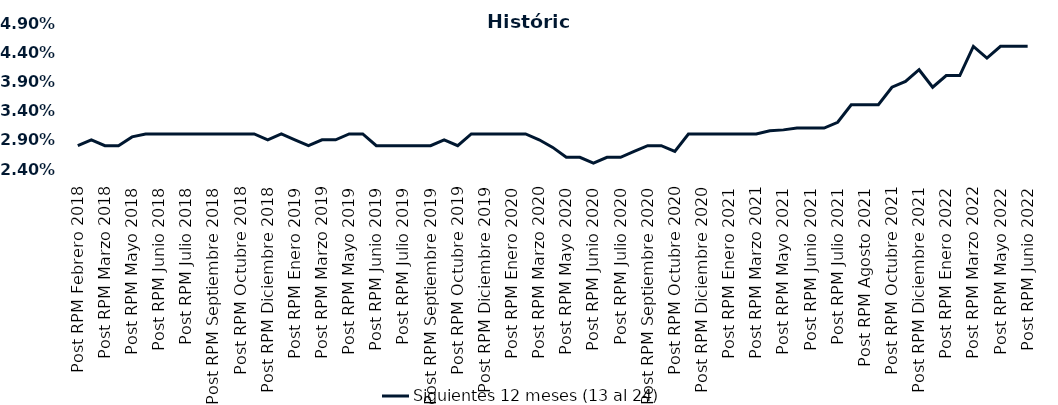
| Category | Siguientes 12 meses (13 al 24)  |
|---|---|
| Post RPM Febrero 2018 | 0.028 |
| Pre RPM Marzo 2018 | 0.029 |
| Post RPM Marzo 2018 | 0.028 |
| Pre RPM Mayo 2018 | 0.028 |
| Post RPM Mayo 2018 | 0.03 |
| Pre RPM Junio 2018 | 0.03 |
| Post RPM Junio 2018 | 0.03 |
| Pre RPM Julio 2018 | 0.03 |
| Post RPM Julio 2018 | 0.03 |
| Pre RPM Septiembre 2018 | 0.03 |
| Post RPM Septiembre 2018 | 0.03 |
| Pre RPM Octubre 2018 | 0.03 |
| Post RPM Octubre 2018 | 0.03 |
| Pre RPM Diciembre 2018 | 0.03 |
| Post RPM Diciembre 2018 | 0.029 |
| Pre RPM Enero 2019 | 0.03 |
| Post RPM Enero 2019 | 0.029 |
| Pre RPM Marzo 2019 | 0.028 |
| Post RPM Marzo 2019 | 0.029 |
| Pre RPM Mayo 2019 | 0.029 |
| Post RPM Mayo 2019 | 0.03 |
| Pre RPM Junio 2019 | 0.03 |
| Post RPM Junio 2019 | 0.028 |
| Pre RPM Julio 2019 | 0.028 |
| Post RPM Julio 2019 | 0.028 |
| Pre RPM Septiembre 2019 | 0.028 |
| Post RPM Septiembre 2019 | 0.028 |
| Pre RPM Octubre 2019 | 0.029 |
| Post RPM Octubre 2019 | 0.028 |
| Pre RPM Diciembre 2019 | 0.03 |
| Post RPM Diciembre 2019 | 0.03 |
| Pre RPM Enero 2020 | 0.03 |
| Post RPM Enero 2020 | 0.03 |
| Pre RPM Marzo 2020 | 0.03 |
| Post RPM Marzo 2020 | 0.029 |
| Pre RPM Mayo 2020 | 0.028 |
| Post RPM Mayo 2020 | 0.026 |
| Pre RPM Junio 2020 | 0.026 |
| Post RPM Junio 2020 | 0.025 |
| Pre RPM Julio 2020 | 0.026 |
| Post RPM Julio 2020 | 0.026 |
| Pre RPM Septiembre 2020 | 0.027 |
| Post RPM Septiembre 2020 | 0.028 |
| Pre RPM Octubre 2020 | 0.028 |
| Post RPM Octubre 2020 | 0.027 |
| Pre RPM Diciembre 2020 | 0.03 |
| Post RPM Diciembre 2020 | 0.03 |
| Pre RPM Enero 2021 | 0.03 |
| Post RPM Enero 2021 | 0.03 |
| Pre RPM Marzo 2021 | 0.03 |
| Post RPM Marzo 2021 | 0.03 |
| Pre RPM Mayo 2021 | 0.031 |
| Post RPM Mayo 2021 | 0.031 |
| Pre RPM Junio 2021 | 0.031 |
| Post RPM Junio 2021 | 0.031 |
| Pre RPM Julio 2021 | 0.031 |
| Post RPM Julio 2021 | 0.032 |
| Pre RPM Agosto 2021 | 0.035 |
| Post RPM Agosto 2021 | 0.035 |
| Pre RPM Octubre 2021 | 0.035 |
| Post RPM Octubre 2021 | 0.038 |
| Pre RPM Diciembre 2021 | 0.039 |
| Post RPM Diciembre 2021 | 0.041 |
| Pre RPM Enero 2022 | 0.038 |
| Post RPM Enero 2022 | 0.04 |
| Pre RPM Marzo 2022 | 0.04 |
| Post RPM Marzo 2022 | 0.045 |
| Pre RPM Mayo 2022 | 0.043 |
| Post RPM Mayo 2022 | 0.045 |
| Pre RPM Junio 2022 | 0.045 |
| Post RPM Junio 2022 | 0.045 |